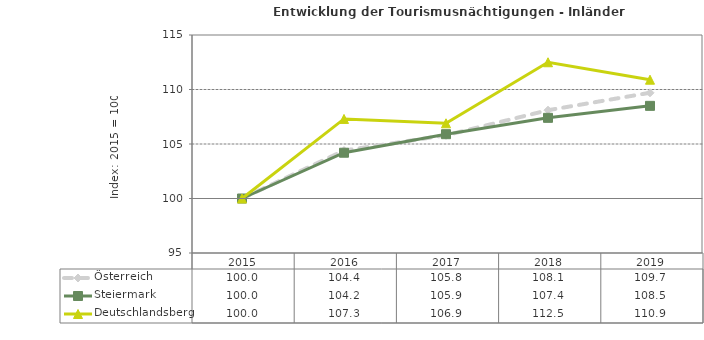
| Category | Österreich | Steiermark | Deutschlandsberg |
|---|---|---|---|
| 2019.0 | 109.7 | 108.5 | 110.9 |
| 2018.0 | 108.1 | 107.4 | 112.5 |
| 2017.0 | 105.8 | 105.9 | 106.9 |
| 2016.0 | 104.4 | 104.2 | 107.3 |
| 2015.0 | 100 | 100 | 100 |